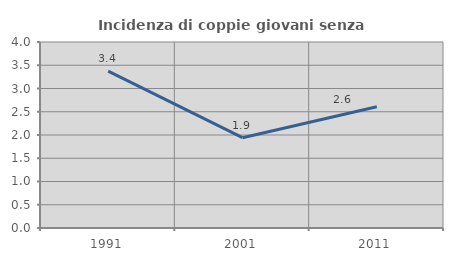
| Category | Incidenza di coppie giovani senza figli |
|---|---|
| 1991.0 | 3.373 |
| 2001.0 | 1.942 |
| 2011.0 | 2.609 |